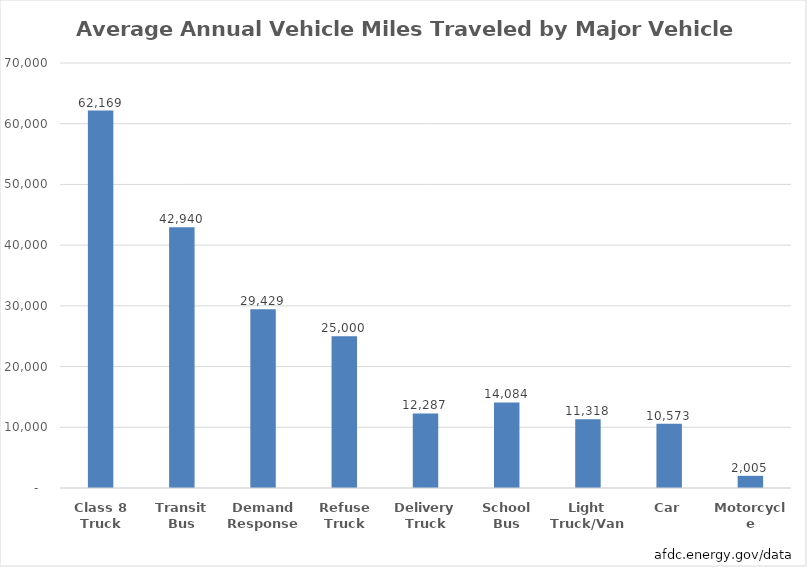
| Category | VMT per Vehicle |
|---|---|
| Class 8 Truck | 62169 |
| Transit Bus | 42940 |
| Demand Response | 29429 |
| Refuse Truck | 25000 |
| Delivery Truck | 12287 |
| School Bus | 14084 |
| Light Truck/Van | 11318 |
| Car | 10573 |
| Motorcycle | 2005 |